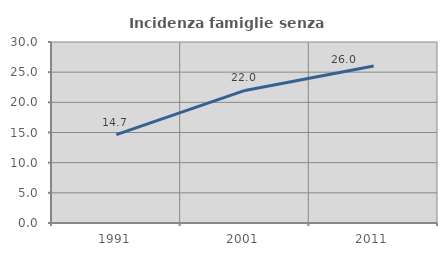
| Category | Incidenza famiglie senza nuclei |
|---|---|
| 1991.0 | 14.653 |
| 2001.0 | 21.973 |
| 2011.0 | 26.015 |